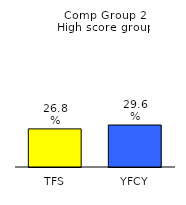
| Category | Series 0 |
|---|---|
| TFS | 0.268 |
| YFCY | 0.296 |